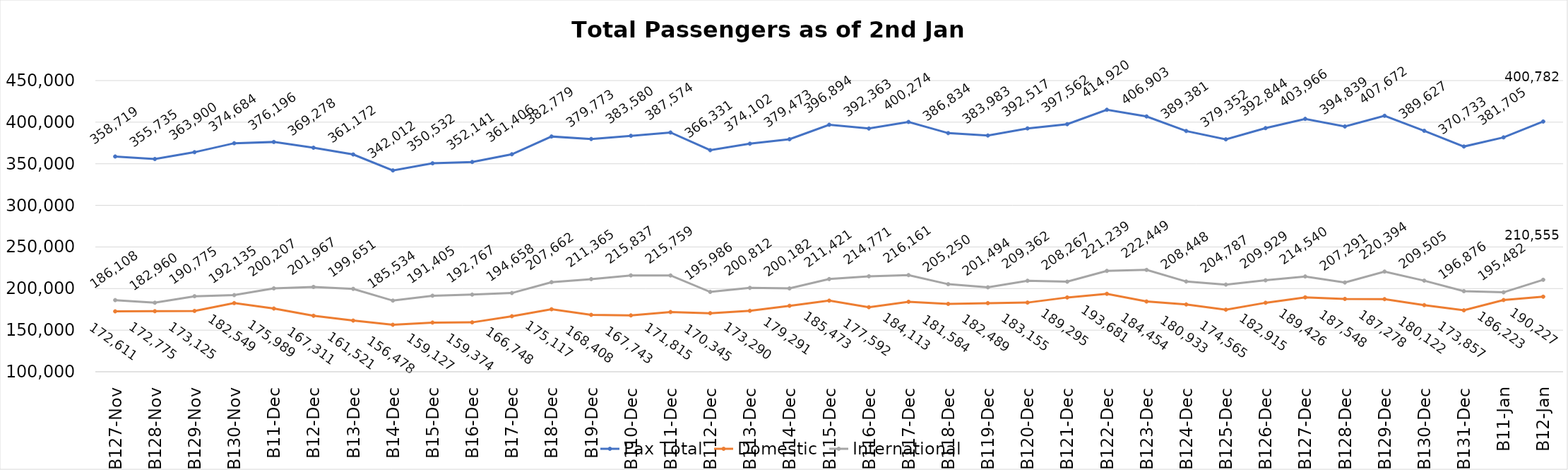
| Category | Pax Total | Domestic | International |
|---|---|---|---|
| 2023-11-27 | 358719 | 172611 | 186108 |
| 2023-11-28 | 355735 | 172775 | 182960 |
| 2023-11-29 | 363900 | 173125 | 190775 |
| 2023-11-30 | 374684 | 182549 | 192135 |
| 2023-12-01 | 376196 | 175989 | 200207 |
| 2023-12-02 | 369278 | 167311 | 201967 |
| 2023-12-03 | 361172 | 161521 | 199651 |
| 2023-12-04 | 342012 | 156478 | 185534 |
| 2023-12-05 | 350532 | 159127 | 191405 |
| 2023-12-06 | 352141 | 159374 | 192767 |
| 2023-12-07 | 361406 | 166748 | 194658 |
| 2023-12-08 | 382779 | 175117 | 207662 |
| 2023-12-09 | 379773 | 168408 | 211365 |
| 2023-12-10 | 383580 | 167743 | 215837 |
| 2023-12-11 | 387574 | 171815 | 215759 |
| 2023-12-12 | 366331 | 170345 | 195986 |
| 2023-12-13 | 374102 | 173290 | 200812 |
| 2023-12-14 | 379473 | 179291 | 200182 |
| 2023-12-15 | 396894 | 185473 | 211421 |
| 2023-12-16 | 392363 | 177592 | 214771 |
| 2023-12-17 | 400274 | 184113 | 216161 |
| 2023-12-18 | 386834 | 181584 | 205250 |
| 2023-12-19 | 383983 | 182489 | 201494 |
| 2023-12-20 | 392517 | 183155 | 209362 |
| 2023-12-21 | 397562 | 189295 | 208267 |
| 2023-12-22 | 414920 | 193681 | 221239 |
| 2023-12-23 | 406903 | 184454 | 222449 |
| 2023-12-24 | 389381 | 180933 | 208448 |
| 2023-12-25 | 379352 | 174565 | 204787 |
| 2023-12-26 | 392844 | 182915 | 209929 |
| 2023-12-27 | 403966 | 189426 | 214540 |
| 2023-12-28 | 394839 | 187548 | 207291 |
| 2023-12-29 | 407672 | 187278 | 220394 |
| 2023-12-30 | 389627 | 180122 | 209505 |
| 2023-12-31 | 370733 | 173857 | 196876 |
| 2024-01-01 | 381705 | 186223 | 195482 |
| 2024-01-02 | 400782 | 190227 | 210555 |